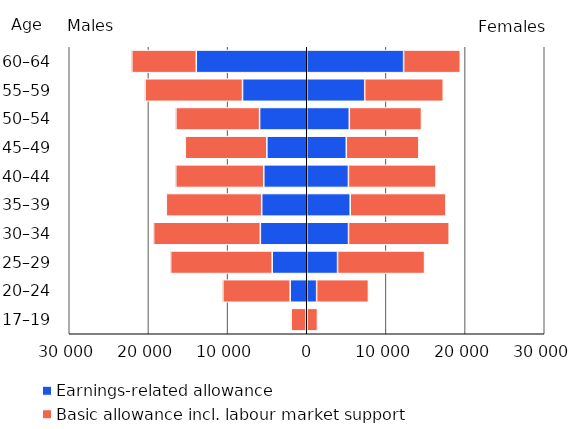
| Category | Series 0 | Series 1 | Earnings-related allowance | Basic allowance incl. labour market support |
|---|---|---|---|---|
| 17–19 | -90 | -1875 | 32 | 1323 |
| 20–24 | -2091 | -8506 | 1249 | 6545 |
| 25–29 | -4364 | -12827 | 3892 | 10991 |
| 30–34 | -5861 | -13483 | 5277 | 12715 |
| 35–39 | -5691 | -12048 | 5491 | 12084 |
| 40–44 | -5426 | -11122 | 5267 | 11061 |
| 45–49 | -5040 | -10301 | 4997 | 9171 |
| 50–54 | -5956 | -10576 | 5377 | 9117 |
| 55–59 | -8112 | -12311 | 7322 | 9924 |
| 60–64 | -13952 | -8147 | 12236 | 7160 |